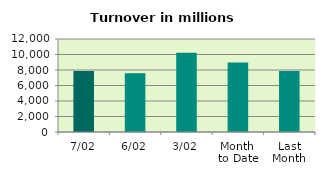
| Category | Series 0 |
|---|---|
| 7/02 | 7872.32 |
| 6/02 | 7572.516 |
| 3/02 | 10219.556 |
| Month 
to Date | 8973.328 |
| Last
Month | 7855.802 |